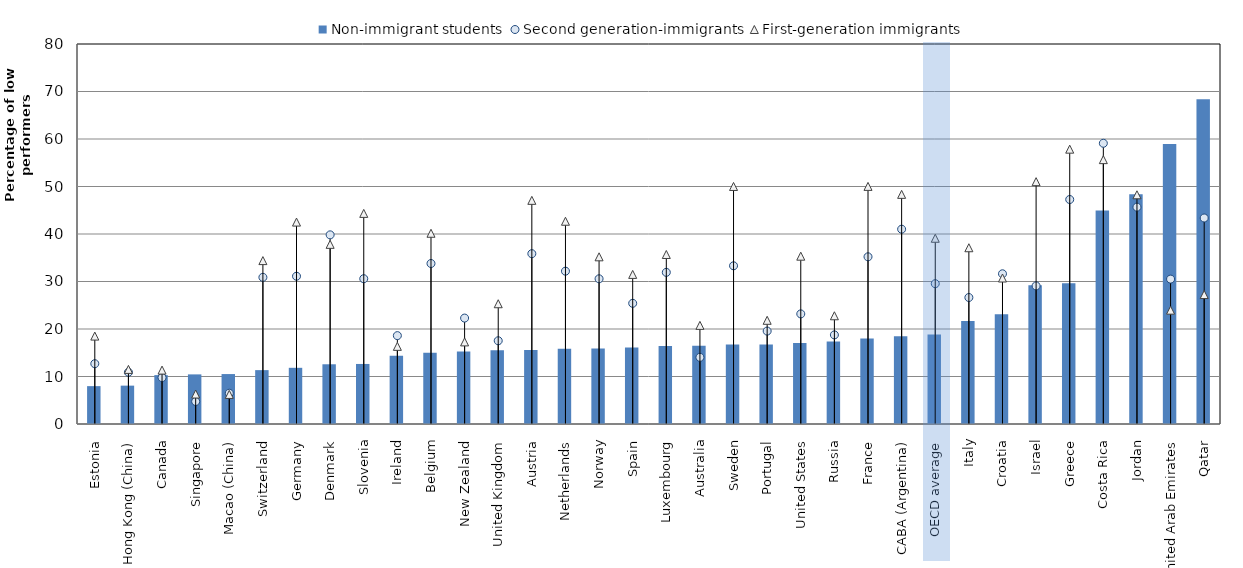
| Category | Non-immigrant students |
|---|---|
| Estonia | 7.971 |
| Hong Kong (China) | 8.077 |
| Canada | 10.292 |
| Singapore | 10.445 |
| Macao (China) | 10.514 |
| Switzerland | 11.343 |
| Germany | 11.83 |
| Denmark | 12.574 |
| Slovenia | 12.639 |
| Ireland | 14.386 |
| Belgium | 14.987 |
| New Zealand | 15.272 |
| United Kingdom | 15.521 |
| Austria | 15.56 |
| Netherlands | 15.868 |
| Norway | 15.889 |
| Spain | 16.085 |
| Luxembourg | 16.433 |
| Australia | 16.488 |
| Sweden | 16.718 |
| Portugal | 16.761 |
| United States | 17.058 |
| Russia | 17.364 |
| France | 17.975 |
| CABA (Argentina) | 18.478 |
| OECD average | 18.854 |
| Italy | 21.707 |
| Croatia | 23.107 |
| Israel | 29.2 |
| Greece | 29.631 |
| Costa Rica | 44.961 |
| Jordan | 48.378 |
| United Arab Emirates | 58.953 |
| Qatar | 68.391 |